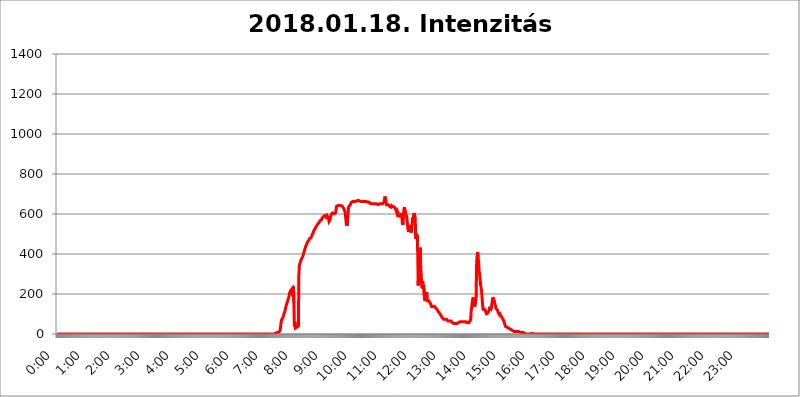
| Category | 2018.01.18. Intenzitás [W/m^2] |
|---|---|
| 0.0 | 0 |
| 0.0006944444444444445 | 0 |
| 0.001388888888888889 | 0 |
| 0.0020833333333333333 | 0 |
| 0.002777777777777778 | 0 |
| 0.003472222222222222 | 0 |
| 0.004166666666666667 | 0 |
| 0.004861111111111111 | 0 |
| 0.005555555555555556 | 0 |
| 0.0062499999999999995 | 0 |
| 0.006944444444444444 | 0 |
| 0.007638888888888889 | 0 |
| 0.008333333333333333 | 0 |
| 0.009027777777777779 | 0 |
| 0.009722222222222222 | 0 |
| 0.010416666666666666 | 0 |
| 0.011111111111111112 | 0 |
| 0.011805555555555555 | 0 |
| 0.012499999999999999 | 0 |
| 0.013194444444444444 | 0 |
| 0.013888888888888888 | 0 |
| 0.014583333333333332 | 0 |
| 0.015277777777777777 | 0 |
| 0.015972222222222224 | 0 |
| 0.016666666666666666 | 0 |
| 0.017361111111111112 | 0 |
| 0.018055555555555557 | 0 |
| 0.01875 | 0 |
| 0.019444444444444445 | 0 |
| 0.02013888888888889 | 0 |
| 0.020833333333333332 | 0 |
| 0.02152777777777778 | 0 |
| 0.022222222222222223 | 0 |
| 0.02291666666666667 | 0 |
| 0.02361111111111111 | 0 |
| 0.024305555555555556 | 0 |
| 0.024999999999999998 | 0 |
| 0.025694444444444447 | 0 |
| 0.02638888888888889 | 0 |
| 0.027083333333333334 | 0 |
| 0.027777777777777776 | 0 |
| 0.02847222222222222 | 0 |
| 0.029166666666666664 | 0 |
| 0.029861111111111113 | 0 |
| 0.030555555555555555 | 0 |
| 0.03125 | 0 |
| 0.03194444444444445 | 0 |
| 0.03263888888888889 | 0 |
| 0.03333333333333333 | 0 |
| 0.034027777777777775 | 0 |
| 0.034722222222222224 | 0 |
| 0.035416666666666666 | 0 |
| 0.036111111111111115 | 0 |
| 0.03680555555555556 | 0 |
| 0.0375 | 0 |
| 0.03819444444444444 | 0 |
| 0.03888888888888889 | 0 |
| 0.03958333333333333 | 0 |
| 0.04027777777777778 | 0 |
| 0.04097222222222222 | 0 |
| 0.041666666666666664 | 0 |
| 0.042361111111111106 | 0 |
| 0.04305555555555556 | 0 |
| 0.043750000000000004 | 0 |
| 0.044444444444444446 | 0 |
| 0.04513888888888889 | 0 |
| 0.04583333333333334 | 0 |
| 0.04652777777777778 | 0 |
| 0.04722222222222222 | 0 |
| 0.04791666666666666 | 0 |
| 0.04861111111111111 | 0 |
| 0.049305555555555554 | 0 |
| 0.049999999999999996 | 0 |
| 0.05069444444444445 | 0 |
| 0.051388888888888894 | 0 |
| 0.052083333333333336 | 0 |
| 0.05277777777777778 | 0 |
| 0.05347222222222222 | 0 |
| 0.05416666666666667 | 0 |
| 0.05486111111111111 | 0 |
| 0.05555555555555555 | 0 |
| 0.05625 | 0 |
| 0.05694444444444444 | 0 |
| 0.057638888888888885 | 0 |
| 0.05833333333333333 | 0 |
| 0.05902777777777778 | 0 |
| 0.059722222222222225 | 0 |
| 0.06041666666666667 | 0 |
| 0.061111111111111116 | 0 |
| 0.06180555555555556 | 0 |
| 0.0625 | 0 |
| 0.06319444444444444 | 0 |
| 0.06388888888888888 | 0 |
| 0.06458333333333334 | 0 |
| 0.06527777777777778 | 0 |
| 0.06597222222222222 | 0 |
| 0.06666666666666667 | 0 |
| 0.06736111111111111 | 0 |
| 0.06805555555555555 | 0 |
| 0.06874999999999999 | 0 |
| 0.06944444444444443 | 0 |
| 0.07013888888888889 | 0 |
| 0.07083333333333333 | 0 |
| 0.07152777777777779 | 0 |
| 0.07222222222222223 | 0 |
| 0.07291666666666667 | 0 |
| 0.07361111111111111 | 0 |
| 0.07430555555555556 | 0 |
| 0.075 | 0 |
| 0.07569444444444444 | 0 |
| 0.0763888888888889 | 0 |
| 0.07708333333333334 | 0 |
| 0.07777777777777778 | 0 |
| 0.07847222222222222 | 0 |
| 0.07916666666666666 | 0 |
| 0.0798611111111111 | 0 |
| 0.08055555555555556 | 0 |
| 0.08125 | 0 |
| 0.08194444444444444 | 0 |
| 0.08263888888888889 | 0 |
| 0.08333333333333333 | 0 |
| 0.08402777777777777 | 0 |
| 0.08472222222222221 | 0 |
| 0.08541666666666665 | 0 |
| 0.08611111111111112 | 0 |
| 0.08680555555555557 | 0 |
| 0.08750000000000001 | 0 |
| 0.08819444444444445 | 0 |
| 0.08888888888888889 | 0 |
| 0.08958333333333333 | 0 |
| 0.09027777777777778 | 0 |
| 0.09097222222222222 | 0 |
| 0.09166666666666667 | 0 |
| 0.09236111111111112 | 0 |
| 0.09305555555555556 | 0 |
| 0.09375 | 0 |
| 0.09444444444444444 | 0 |
| 0.09513888888888888 | 0 |
| 0.09583333333333333 | 0 |
| 0.09652777777777777 | 0 |
| 0.09722222222222222 | 0 |
| 0.09791666666666667 | 0 |
| 0.09861111111111111 | 0 |
| 0.09930555555555555 | 0 |
| 0.09999999999999999 | 0 |
| 0.10069444444444443 | 0 |
| 0.1013888888888889 | 0 |
| 0.10208333333333335 | 0 |
| 0.10277777777777779 | 0 |
| 0.10347222222222223 | 0 |
| 0.10416666666666667 | 0 |
| 0.10486111111111111 | 0 |
| 0.10555555555555556 | 0 |
| 0.10625 | 0 |
| 0.10694444444444444 | 0 |
| 0.1076388888888889 | 0 |
| 0.10833333333333334 | 0 |
| 0.10902777777777778 | 0 |
| 0.10972222222222222 | 0 |
| 0.1111111111111111 | 0 |
| 0.11180555555555556 | 0 |
| 0.11180555555555556 | 0 |
| 0.1125 | 0 |
| 0.11319444444444444 | 0 |
| 0.11388888888888889 | 0 |
| 0.11458333333333333 | 0 |
| 0.11527777777777777 | 0 |
| 0.11597222222222221 | 0 |
| 0.11666666666666665 | 0 |
| 0.1173611111111111 | 0 |
| 0.11805555555555557 | 0 |
| 0.11944444444444445 | 0 |
| 0.12013888888888889 | 0 |
| 0.12083333333333333 | 0 |
| 0.12152777777777778 | 0 |
| 0.12222222222222223 | 0 |
| 0.12291666666666667 | 0 |
| 0.12291666666666667 | 0 |
| 0.12361111111111112 | 0 |
| 0.12430555555555556 | 0 |
| 0.125 | 0 |
| 0.12569444444444444 | 0 |
| 0.12638888888888888 | 0 |
| 0.12708333333333333 | 0 |
| 0.16875 | 0 |
| 0.12847222222222224 | 0 |
| 0.12916666666666668 | 0 |
| 0.12986111111111112 | 0 |
| 0.13055555555555556 | 0 |
| 0.13125 | 0 |
| 0.13194444444444445 | 0 |
| 0.1326388888888889 | 0 |
| 0.13333333333333333 | 0 |
| 0.13402777777777777 | 0 |
| 0.13402777777777777 | 0 |
| 0.13472222222222222 | 0 |
| 0.13541666666666666 | 0 |
| 0.1361111111111111 | 0 |
| 0.13749999999999998 | 0 |
| 0.13819444444444443 | 0 |
| 0.1388888888888889 | 0 |
| 0.13958333333333334 | 0 |
| 0.14027777777777778 | 0 |
| 0.14097222222222222 | 0 |
| 0.14166666666666666 | 0 |
| 0.1423611111111111 | 0 |
| 0.14305555555555557 | 0 |
| 0.14375000000000002 | 0 |
| 0.14444444444444446 | 0 |
| 0.1451388888888889 | 0 |
| 0.1451388888888889 | 0 |
| 0.14652777777777778 | 0 |
| 0.14722222222222223 | 0 |
| 0.14791666666666667 | 0 |
| 0.1486111111111111 | 0 |
| 0.14930555555555555 | 0 |
| 0.15 | 0 |
| 0.15069444444444444 | 0 |
| 0.15138888888888888 | 0 |
| 0.15208333333333332 | 0 |
| 0.15277777777777776 | 0 |
| 0.15347222222222223 | 0 |
| 0.15416666666666667 | 0 |
| 0.15486111111111112 | 0 |
| 0.15555555555555556 | 0 |
| 0.15625 | 0 |
| 0.15694444444444444 | 0 |
| 0.15763888888888888 | 0 |
| 0.15833333333333333 | 0 |
| 0.15902777777777777 | 0 |
| 0.15972222222222224 | 0 |
| 0.16041666666666668 | 0 |
| 0.16111111111111112 | 0 |
| 0.16180555555555556 | 0 |
| 0.1625 | 0 |
| 0.16319444444444445 | 0 |
| 0.1638888888888889 | 0 |
| 0.16458333333333333 | 0 |
| 0.16527777777777777 | 0 |
| 0.16597222222222222 | 0 |
| 0.16666666666666666 | 0 |
| 0.1673611111111111 | 0 |
| 0.16805555555555554 | 0 |
| 0.16874999999999998 | 0 |
| 0.16944444444444443 | 0 |
| 0.17013888888888887 | 0 |
| 0.1708333333333333 | 0 |
| 0.17152777777777775 | 0 |
| 0.17222222222222225 | 0 |
| 0.1729166666666667 | 0 |
| 0.17361111111111113 | 0 |
| 0.17430555555555557 | 0 |
| 0.17500000000000002 | 0 |
| 0.17569444444444446 | 0 |
| 0.1763888888888889 | 0 |
| 0.17708333333333334 | 0 |
| 0.17777777777777778 | 0 |
| 0.17847222222222223 | 0 |
| 0.17916666666666667 | 0 |
| 0.1798611111111111 | 0 |
| 0.18055555555555555 | 0 |
| 0.18125 | 0 |
| 0.18194444444444444 | 0 |
| 0.1826388888888889 | 0 |
| 0.18333333333333335 | 0 |
| 0.1840277777777778 | 0 |
| 0.18472222222222223 | 0 |
| 0.18541666666666667 | 0 |
| 0.18611111111111112 | 0 |
| 0.18680555555555556 | 0 |
| 0.1875 | 0 |
| 0.18819444444444444 | 0 |
| 0.18888888888888888 | 0 |
| 0.18958333333333333 | 0 |
| 0.19027777777777777 | 0 |
| 0.1909722222222222 | 0 |
| 0.19166666666666665 | 0 |
| 0.19236111111111112 | 0 |
| 0.19305555555555554 | 0 |
| 0.19375 | 0 |
| 0.19444444444444445 | 0 |
| 0.1951388888888889 | 0 |
| 0.19583333333333333 | 0 |
| 0.19652777777777777 | 0 |
| 0.19722222222222222 | 0 |
| 0.19791666666666666 | 0 |
| 0.1986111111111111 | 0 |
| 0.19930555555555554 | 0 |
| 0.19999999999999998 | 0 |
| 0.20069444444444443 | 0 |
| 0.20138888888888887 | 0 |
| 0.2020833333333333 | 0 |
| 0.2027777777777778 | 0 |
| 0.2034722222222222 | 0 |
| 0.2041666666666667 | 0 |
| 0.20486111111111113 | 0 |
| 0.20555555555555557 | 0 |
| 0.20625000000000002 | 0 |
| 0.20694444444444446 | 0 |
| 0.2076388888888889 | 0 |
| 0.20833333333333334 | 0 |
| 0.20902777777777778 | 0 |
| 0.20972222222222223 | 0 |
| 0.21041666666666667 | 0 |
| 0.2111111111111111 | 0 |
| 0.21180555555555555 | 0 |
| 0.2125 | 0 |
| 0.21319444444444444 | 0 |
| 0.2138888888888889 | 0 |
| 0.21458333333333335 | 0 |
| 0.2152777777777778 | 0 |
| 0.21597222222222223 | 0 |
| 0.21666666666666667 | 0 |
| 0.21736111111111112 | 0 |
| 0.21805555555555556 | 0 |
| 0.21875 | 0 |
| 0.21944444444444444 | 0 |
| 0.22013888888888888 | 0 |
| 0.22083333333333333 | 0 |
| 0.22152777777777777 | 0 |
| 0.2222222222222222 | 0 |
| 0.22291666666666665 | 0 |
| 0.2236111111111111 | 0 |
| 0.22430555555555556 | 0 |
| 0.225 | 0 |
| 0.22569444444444445 | 0 |
| 0.2263888888888889 | 0 |
| 0.22708333333333333 | 0 |
| 0.22777777777777777 | 0 |
| 0.22847222222222222 | 0 |
| 0.22916666666666666 | 0 |
| 0.2298611111111111 | 0 |
| 0.23055555555555554 | 0 |
| 0.23124999999999998 | 0 |
| 0.23194444444444443 | 0 |
| 0.23263888888888887 | 0 |
| 0.2333333333333333 | 0 |
| 0.2340277777777778 | 0 |
| 0.2347222222222222 | 0 |
| 0.2354166666666667 | 0 |
| 0.23611111111111113 | 0 |
| 0.23680555555555557 | 0 |
| 0.23750000000000002 | 0 |
| 0.23819444444444446 | 0 |
| 0.2388888888888889 | 0 |
| 0.23958333333333334 | 0 |
| 0.24027777777777778 | 0 |
| 0.24097222222222223 | 0 |
| 0.24166666666666667 | 0 |
| 0.2423611111111111 | 0 |
| 0.24305555555555555 | 0 |
| 0.24375 | 0 |
| 0.24444444444444446 | 0 |
| 0.24513888888888888 | 0 |
| 0.24583333333333335 | 0 |
| 0.2465277777777778 | 0 |
| 0.24722222222222223 | 0 |
| 0.24791666666666667 | 0 |
| 0.24861111111111112 | 0 |
| 0.24930555555555556 | 0 |
| 0.25 | 0 |
| 0.25069444444444444 | 0 |
| 0.2513888888888889 | 0 |
| 0.2520833333333333 | 0 |
| 0.25277777777777777 | 0 |
| 0.2534722222222222 | 0 |
| 0.25416666666666665 | 0 |
| 0.2548611111111111 | 0 |
| 0.2555555555555556 | 0 |
| 0.25625000000000003 | 0 |
| 0.2569444444444445 | 0 |
| 0.2576388888888889 | 0 |
| 0.25833333333333336 | 0 |
| 0.2590277777777778 | 0 |
| 0.25972222222222224 | 0 |
| 0.2604166666666667 | 0 |
| 0.2611111111111111 | 0 |
| 0.26180555555555557 | 0 |
| 0.2625 | 0 |
| 0.26319444444444445 | 0 |
| 0.2638888888888889 | 0 |
| 0.26458333333333334 | 0 |
| 0.2652777777777778 | 0 |
| 0.2659722222222222 | 0 |
| 0.26666666666666666 | 0 |
| 0.2673611111111111 | 0 |
| 0.26805555555555555 | 0 |
| 0.26875 | 0 |
| 0.26944444444444443 | 0 |
| 0.2701388888888889 | 0 |
| 0.2708333333333333 | 0 |
| 0.27152777777777776 | 0 |
| 0.2722222222222222 | 0 |
| 0.27291666666666664 | 0 |
| 0.2736111111111111 | 0 |
| 0.2743055555555555 | 0 |
| 0.27499999999999997 | 0 |
| 0.27569444444444446 | 0 |
| 0.27638888888888885 | 0 |
| 0.27708333333333335 | 0 |
| 0.2777777777777778 | 0 |
| 0.27847222222222223 | 0 |
| 0.2791666666666667 | 0 |
| 0.2798611111111111 | 0 |
| 0.28055555555555556 | 0 |
| 0.28125 | 0 |
| 0.28194444444444444 | 0 |
| 0.2826388888888889 | 0 |
| 0.2833333333333333 | 0 |
| 0.28402777777777777 | 0 |
| 0.2847222222222222 | 0 |
| 0.28541666666666665 | 0 |
| 0.28611111111111115 | 0 |
| 0.28680555555555554 | 0 |
| 0.28750000000000003 | 0 |
| 0.2881944444444445 | 0 |
| 0.2888888888888889 | 0 |
| 0.28958333333333336 | 0 |
| 0.2902777777777778 | 0 |
| 0.29097222222222224 | 0 |
| 0.2916666666666667 | 0 |
| 0.2923611111111111 | 0 |
| 0.29305555555555557 | 0 |
| 0.29375 | 0 |
| 0.29444444444444445 | 0 |
| 0.2951388888888889 | 0 |
| 0.29583333333333334 | 0 |
| 0.2965277777777778 | 0 |
| 0.2972222222222222 | 0 |
| 0.29791666666666666 | 0 |
| 0.2986111111111111 | 0 |
| 0.29930555555555555 | 0 |
| 0.3 | 0 |
| 0.30069444444444443 | 0 |
| 0.3013888888888889 | 0 |
| 0.3020833333333333 | 0 |
| 0.30277777777777776 | 0 |
| 0.3034722222222222 | 0 |
| 0.30416666666666664 | 0 |
| 0.3048611111111111 | 3.525 |
| 0.3055555555555555 | 3.525 |
| 0.30624999999999997 | 3.525 |
| 0.3069444444444444 | 3.525 |
| 0.3076388888888889 | 3.525 |
| 0.30833333333333335 | 7.887 |
| 0.3090277777777778 | 7.887 |
| 0.30972222222222223 | 7.887 |
| 0.3104166666666667 | 7.887 |
| 0.3111111111111111 | 7.887 |
| 0.31180555555555556 | 12.257 |
| 0.3125 | 16.636 |
| 0.31319444444444444 | 34.234 |
| 0.3138888888888889 | 56.398 |
| 0.3145833333333333 | 69.775 |
| 0.31527777777777777 | 74.246 |
| 0.3159722222222222 | 74.246 |
| 0.31666666666666665 | 83.205 |
| 0.31736111111111115 | 92.184 |
| 0.31805555555555554 | 101.184 |
| 0.31875000000000003 | 105.69 |
| 0.3194444444444445 | 114.716 |
| 0.3201388888888889 | 128.284 |
| 0.32083333333333336 | 137.347 |
| 0.3215277777777778 | 146.423 |
| 0.32222222222222224 | 155.509 |
| 0.3229166666666667 | 160.056 |
| 0.3236111111111111 | 169.156 |
| 0.32430555555555557 | 178.264 |
| 0.325 | 187.378 |
| 0.32569444444444445 | 201.058 |
| 0.3263888888888889 | 210.182 |
| 0.32708333333333334 | 214.746 |
| 0.3277777777777778 | 219.309 |
| 0.3284722222222222 | 219.309 |
| 0.32916666666666666 | 223.873 |
| 0.3298611111111111 | 228.436 |
| 0.33055555555555555 | 187.378 |
| 0.33125 | 237.564 |
| 0.33194444444444443 | 155.509 |
| 0.3326388888888889 | 38.653 |
| 0.3333333333333333 | 60.85 |
| 0.3340277777777778 | 29.823 |
| 0.3347222222222222 | 29.823 |
| 0.3354166666666667 | 29.823 |
| 0.3361111111111111 | 34.234 |
| 0.3368055555555556 | 34.234 |
| 0.33749999999999997 | 38.653 |
| 0.33819444444444446 | 38.653 |
| 0.33888888888888885 | 296.808 |
| 0.33958333333333335 | 342.162 |
| 0.34027777777777773 | 351.198 |
| 0.34097222222222223 | 360.221 |
| 0.3416666666666666 | 364.728 |
| 0.3423611111111111 | 373.729 |
| 0.3430555555555555 | 373.729 |
| 0.34375 | 382.715 |
| 0.3444444444444445 | 382.715 |
| 0.3451388888888889 | 396.164 |
| 0.3458333333333334 | 405.108 |
| 0.34652777777777777 | 414.035 |
| 0.34722222222222227 | 422.943 |
| 0.34791666666666665 | 431.833 |
| 0.34861111111111115 | 440.702 |
| 0.34930555555555554 | 445.129 |
| 0.35000000000000003 | 449.551 |
| 0.3506944444444444 | 458.38 |
| 0.3513888888888889 | 458.38 |
| 0.3520833333333333 | 462.786 |
| 0.3527777777777778 | 467.187 |
| 0.3534722222222222 | 475.972 |
| 0.3541666666666667 | 475.972 |
| 0.3548611111111111 | 480.356 |
| 0.35555555555555557 | 480.356 |
| 0.35625 | 480.356 |
| 0.35694444444444445 | 489.108 |
| 0.3576388888888889 | 497.836 |
| 0.35833333333333334 | 502.192 |
| 0.3590277777777778 | 506.542 |
| 0.3597222222222222 | 515.223 |
| 0.36041666666666666 | 515.223 |
| 0.3611111111111111 | 523.88 |
| 0.36180555555555555 | 528.2 |
| 0.3625 | 532.513 |
| 0.36319444444444443 | 532.513 |
| 0.3638888888888889 | 541.121 |
| 0.3645833333333333 | 545.416 |
| 0.3652777777777778 | 549.704 |
| 0.3659722222222222 | 553.986 |
| 0.3666666666666667 | 553.986 |
| 0.3673611111111111 | 558.261 |
| 0.3680555555555556 | 562.53 |
| 0.36874999999999997 | 566.793 |
| 0.36944444444444446 | 566.793 |
| 0.37013888888888885 | 571.049 |
| 0.37083333333333335 | 571.049 |
| 0.37152777777777773 | 579.542 |
| 0.37222222222222223 | 579.542 |
| 0.3729166666666666 | 583.779 |
| 0.3736111111111111 | 588.009 |
| 0.3743055555555555 | 592.233 |
| 0.375 | 592.233 |
| 0.3756944444444445 | 592.233 |
| 0.3763888888888889 | 588.009 |
| 0.3770833333333334 | 583.779 |
| 0.37777777777777777 | 588.009 |
| 0.37847222222222227 | 592.233 |
| 0.37916666666666665 | 592.233 |
| 0.37986111111111115 | 583.779 |
| 0.38055555555555554 | 575.299 |
| 0.38125000000000003 | 562.53 |
| 0.3819444444444444 | 558.261 |
| 0.3826388888888889 | 571.049 |
| 0.3833333333333333 | 583.779 |
| 0.3840277777777778 | 596.45 |
| 0.3847222222222222 | 600.661 |
| 0.3854166666666667 | 600.661 |
| 0.3861111111111111 | 604.864 |
| 0.38680555555555557 | 600.661 |
| 0.3875 | 600.661 |
| 0.38819444444444445 | 600.661 |
| 0.3888888888888889 | 600.661 |
| 0.38958333333333334 | 600.661 |
| 0.3902777777777778 | 604.864 |
| 0.3909722222222222 | 617.436 |
| 0.39166666666666666 | 638.256 |
| 0.3923611111111111 | 634.105 |
| 0.39305555555555555 | 642.4 |
| 0.39375 | 642.4 |
| 0.39444444444444443 | 642.4 |
| 0.3951388888888889 | 642.4 |
| 0.3958333333333333 | 642.4 |
| 0.3965277777777778 | 642.4 |
| 0.3972222222222222 | 642.4 |
| 0.3979166666666667 | 642.4 |
| 0.3986111111111111 | 642.4 |
| 0.3993055555555556 | 642.4 |
| 0.39999999999999997 | 638.256 |
| 0.40069444444444446 | 634.105 |
| 0.40138888888888885 | 634.105 |
| 0.40208333333333335 | 625.784 |
| 0.40277777777777773 | 625.784 |
| 0.40347222222222223 | 613.252 |
| 0.4041666666666666 | 596.45 |
| 0.4048611111111111 | 571.049 |
| 0.4055555555555555 | 549.704 |
| 0.40625 | 541.121 |
| 0.4069444444444445 | 553.986 |
| 0.4076388888888889 | 588.009 |
| 0.4083333333333334 | 625.784 |
| 0.40902777777777777 | 638.256 |
| 0.40972222222222227 | 642.4 |
| 0.41041666666666665 | 642.4 |
| 0.41111111111111115 | 646.537 |
| 0.41180555555555554 | 650.667 |
| 0.41250000000000003 | 658.909 |
| 0.4131944444444444 | 654.791 |
| 0.4138888888888889 | 658.909 |
| 0.4145833333333333 | 663.019 |
| 0.4152777777777778 | 663.019 |
| 0.4159722222222222 | 658.909 |
| 0.4166666666666667 | 663.019 |
| 0.4173611111111111 | 663.019 |
| 0.41805555555555557 | 663.019 |
| 0.41875 | 663.019 |
| 0.41944444444444445 | 667.123 |
| 0.4201388888888889 | 667.123 |
| 0.42083333333333334 | 667.123 |
| 0.4215277777777778 | 667.123 |
| 0.4222222222222222 | 663.019 |
| 0.42291666666666666 | 667.123 |
| 0.4236111111111111 | 667.123 |
| 0.42430555555555555 | 667.123 |
| 0.425 | 663.019 |
| 0.42569444444444443 | 667.123 |
| 0.4263888888888889 | 663.019 |
| 0.4270833333333333 | 663.019 |
| 0.4277777777777778 | 663.019 |
| 0.4284722222222222 | 663.019 |
| 0.4291666666666667 | 663.019 |
| 0.4298611111111111 | 658.909 |
| 0.4305555555555556 | 663.019 |
| 0.43124999999999997 | 663.019 |
| 0.43194444444444446 | 663.019 |
| 0.43263888888888885 | 663.019 |
| 0.43333333333333335 | 663.019 |
| 0.43402777777777773 | 658.909 |
| 0.43472222222222223 | 663.019 |
| 0.4354166666666666 | 658.909 |
| 0.4361111111111111 | 663.019 |
| 0.4368055555555555 | 658.909 |
| 0.4375 | 658.909 |
| 0.4381944444444445 | 654.791 |
| 0.4388888888888889 | 654.791 |
| 0.4395833333333334 | 650.667 |
| 0.44027777777777777 | 650.667 |
| 0.44097222222222227 | 650.667 |
| 0.44166666666666665 | 650.667 |
| 0.44236111111111115 | 650.667 |
| 0.44305555555555554 | 650.667 |
| 0.44375000000000003 | 650.667 |
| 0.4444444444444444 | 646.537 |
| 0.4451388888888889 | 650.667 |
| 0.4458333333333333 | 650.667 |
| 0.4465277777777778 | 650.667 |
| 0.4472222222222222 | 654.791 |
| 0.4479166666666667 | 650.667 |
| 0.4486111111111111 | 650.667 |
| 0.44930555555555557 | 650.667 |
| 0.45 | 646.537 |
| 0.45069444444444445 | 650.667 |
| 0.4513888888888889 | 650.667 |
| 0.45208333333333334 | 650.667 |
| 0.4527777777777778 | 650.667 |
| 0.4534722222222222 | 650.667 |
| 0.45416666666666666 | 650.667 |
| 0.4548611111111111 | 646.537 |
| 0.45555555555555555 | 650.667 |
| 0.45625 | 650.667 |
| 0.45694444444444443 | 650.667 |
| 0.4576388888888889 | 654.791 |
| 0.4583333333333333 | 658.909 |
| 0.4590277777777778 | 663.019 |
| 0.4597222222222222 | 687.544 |
| 0.4604166666666667 | 683.473 |
| 0.4611111111111111 | 663.019 |
| 0.4618055555555556 | 646.537 |
| 0.46249999999999997 | 642.4 |
| 0.46319444444444446 | 646.537 |
| 0.46388888888888885 | 646.537 |
| 0.46458333333333335 | 642.4 |
| 0.46527777777777773 | 642.4 |
| 0.46597222222222223 | 638.256 |
| 0.4666666666666666 | 638.256 |
| 0.4673611111111111 | 638.256 |
| 0.4680555555555555 | 642.4 |
| 0.46875 | 634.105 |
| 0.4694444444444445 | 638.256 |
| 0.4701388888888889 | 634.105 |
| 0.4708333333333334 | 638.256 |
| 0.47152777777777777 | 638.256 |
| 0.47222222222222227 | 642.4 |
| 0.47291666666666665 | 634.105 |
| 0.47361111111111115 | 629.948 |
| 0.47430555555555554 | 629.948 |
| 0.47500000000000003 | 621.613 |
| 0.4756944444444444 | 613.252 |
| 0.4763888888888889 | 604.864 |
| 0.4770833333333333 | 613.252 |
| 0.4777777777777778 | 613.252 |
| 0.4784722222222222 | 600.661 |
| 0.4791666666666667 | 583.779 |
| 0.4798611111111111 | 592.233 |
| 0.48055555555555557 | 596.45 |
| 0.48125 | 592.233 |
| 0.48194444444444445 | 592.233 |
| 0.4826388888888889 | 604.864 |
| 0.48333333333333334 | 592.233 |
| 0.4840277777777778 | 553.986 |
| 0.4847222222222222 | 545.416 |
| 0.48541666666666666 | 596.45 |
| 0.4861111111111111 | 596.45 |
| 0.48680555555555555 | 634.105 |
| 0.4875 | 629.948 |
| 0.48819444444444443 | 609.062 |
| 0.4888888888888889 | 613.252 |
| 0.4895833333333333 | 609.062 |
| 0.4902777777777778 | 583.779 |
| 0.4909722222222222 | 558.261 |
| 0.4916666666666667 | 528.2 |
| 0.4923611111111111 | 532.513 |
| 0.4930555555555556 | 510.885 |
| 0.49374999999999997 | 510.885 |
| 0.49444444444444446 | 545.416 |
| 0.49513888888888885 | 545.416 |
| 0.49583333333333335 | 515.223 |
| 0.49652777777777773 | 506.542 |
| 0.49722222222222223 | 528.2 |
| 0.4979166666666666 | 549.704 |
| 0.4986111111111111 | 583.779 |
| 0.4993055555555555 | 571.049 |
| 0.5 | 596.45 |
| 0.5006944444444444 | 604.864 |
| 0.5013888888888889 | 609.062 |
| 0.5020833333333333 | 575.299 |
| 0.5027777777777778 | 475.972 |
| 0.5034722222222222 | 502.192 |
| 0.5041666666666667 | 475.972 |
| 0.5048611111111111 | 493.475 |
| 0.5055555555555555 | 414.035 |
| 0.50625 | 242.127 |
| 0.5069444444444444 | 310.44 |
| 0.5076388888888889 | 314.98 |
| 0.5083333333333333 | 364.728 |
| 0.5090277777777777 | 431.833 |
| 0.5097222222222222 | 333.113 |
| 0.5104166666666666 | 301.354 |
| 0.5111111111111112 | 246.689 |
| 0.5118055555555555 | 228.436 |
| 0.5125000000000001 | 264.932 |
| 0.5131944444444444 | 233 |
| 0.513888888888889 | 242.127 |
| 0.5145833333333333 | 242.127 |
| 0.5152777777777778 | 173.709 |
| 0.5159722222222222 | 164.605 |
| 0.5166666666666667 | 169.156 |
| 0.517361111111111 | 187.378 |
| 0.5180555555555556 | 210.182 |
| 0.5187499999999999 | 173.709 |
| 0.5194444444444445 | 164.605 |
| 0.5201388888888888 | 164.605 |
| 0.5208333333333334 | 160.056 |
| 0.5215277777777778 | 164.605 |
| 0.5222222222222223 | 160.056 |
| 0.5229166666666667 | 160.056 |
| 0.5236111111111111 | 150.964 |
| 0.5243055555555556 | 146.423 |
| 0.525 | 137.347 |
| 0.5256944444444445 | 137.347 |
| 0.5263888888888889 | 137.347 |
| 0.5270833333333333 | 137.347 |
| 0.5277777777777778 | 137.347 |
| 0.5284722222222222 | 137.347 |
| 0.5291666666666667 | 137.347 |
| 0.5298611111111111 | 137.347 |
| 0.5305555555555556 | 137.347 |
| 0.53125 | 128.284 |
| 0.5319444444444444 | 123.758 |
| 0.5326388888888889 | 123.758 |
| 0.5333333333333333 | 119.235 |
| 0.5340277777777778 | 114.716 |
| 0.5347222222222222 | 110.201 |
| 0.5354166666666667 | 105.69 |
| 0.5361111111111111 | 105.69 |
| 0.5368055555555555 | 101.184 |
| 0.5375 | 96.682 |
| 0.5381944444444444 | 92.184 |
| 0.5388888888888889 | 87.692 |
| 0.5395833333333333 | 83.205 |
| 0.5402777777777777 | 83.205 |
| 0.5409722222222222 | 78.722 |
| 0.5416666666666666 | 74.246 |
| 0.5423611111111112 | 78.722 |
| 0.5430555555555555 | 78.722 |
| 0.5437500000000001 | 74.246 |
| 0.5444444444444444 | 74.246 |
| 0.545138888888889 | 74.246 |
| 0.5458333333333333 | 74.246 |
| 0.5465277777777778 | 69.775 |
| 0.5472222222222222 | 69.775 |
| 0.5479166666666667 | 65.31 |
| 0.548611111111111 | 65.31 |
| 0.5493055555555556 | 65.31 |
| 0.5499999999999999 | 65.31 |
| 0.5506944444444445 | 65.31 |
| 0.5513888888888888 | 65.31 |
| 0.5520833333333334 | 65.31 |
| 0.5527777777777778 | 65.31 |
| 0.5534722222222223 | 60.85 |
| 0.5541666666666667 | 56.398 |
| 0.5548611111111111 | 56.398 |
| 0.5555555555555556 | 51.951 |
| 0.55625 | 51.951 |
| 0.5569444444444445 | 51.951 |
| 0.5576388888888889 | 51.951 |
| 0.5583333333333333 | 51.951 |
| 0.5590277777777778 | 51.951 |
| 0.5597222222222222 | 51.951 |
| 0.5604166666666667 | 51.951 |
| 0.5611111111111111 | 51.951 |
| 0.5618055555555556 | 56.398 |
| 0.5625 | 56.398 |
| 0.5631944444444444 | 56.398 |
| 0.5638888888888889 | 56.398 |
| 0.5645833333333333 | 60.85 |
| 0.5652777777777778 | 60.85 |
| 0.5659722222222222 | 60.85 |
| 0.5666666666666667 | 60.85 |
| 0.5673611111111111 | 60.85 |
| 0.5680555555555555 | 60.85 |
| 0.56875 | 60.85 |
| 0.5694444444444444 | 60.85 |
| 0.5701388888888889 | 60.85 |
| 0.5708333333333333 | 60.85 |
| 0.5715277777777777 | 60.85 |
| 0.5722222222222222 | 60.85 |
| 0.5729166666666666 | 60.85 |
| 0.5736111111111112 | 60.85 |
| 0.5743055555555555 | 56.398 |
| 0.5750000000000001 | 56.398 |
| 0.5756944444444444 | 56.398 |
| 0.576388888888889 | 56.398 |
| 0.5770833333333333 | 56.398 |
| 0.5777777777777778 | 56.398 |
| 0.5784722222222222 | 60.85 |
| 0.5791666666666667 | 65.31 |
| 0.579861111111111 | 74.246 |
| 0.5805555555555556 | 114.716 |
| 0.5812499999999999 | 132.814 |
| 0.5819444444444445 | 155.509 |
| 0.5826388888888888 | 169.156 |
| 0.5833333333333334 | 182.82 |
| 0.5840277777777778 | 155.509 |
| 0.5847222222222223 | 150.964 |
| 0.5854166666666667 | 137.347 |
| 0.5861111111111111 | 141.884 |
| 0.5868055555555556 | 164.605 |
| 0.5875 | 182.82 |
| 0.5881944444444445 | 351.198 |
| 0.5888888888888889 | 391.685 |
| 0.5895833333333333 | 409.574 |
| 0.5902777777777778 | 382.715 |
| 0.5909722222222222 | 360.221 |
| 0.5916666666666667 | 314.98 |
| 0.5923611111111111 | 301.354 |
| 0.5930555555555556 | 278.603 |
| 0.59375 | 246.689 |
| 0.5944444444444444 | 233 |
| 0.5951388888888889 | 214.746 |
| 0.5958333333333333 | 182.82 |
| 0.5965277777777778 | 146.423 |
| 0.5972222222222222 | 123.758 |
| 0.5979166666666667 | 128.284 |
| 0.5986111111111111 | 123.758 |
| 0.5993055555555555 | 123.758 |
| 0.6 | 123.758 |
| 0.6006944444444444 | 114.716 |
| 0.6013888888888889 | 110.201 |
| 0.6020833333333333 | 101.184 |
| 0.6027777777777777 | 101.184 |
| 0.6034722222222222 | 101.184 |
| 0.6041666666666666 | 105.69 |
| 0.6048611111111112 | 110.201 |
| 0.6055555555555555 | 119.235 |
| 0.6062500000000001 | 128.284 |
| 0.6069444444444444 | 128.284 |
| 0.607638888888889 | 123.758 |
| 0.6083333333333333 | 123.758 |
| 0.6090277777777778 | 132.814 |
| 0.6097222222222222 | 155.509 |
| 0.6104166666666667 | 169.156 |
| 0.611111111111111 | 182.82 |
| 0.6118055555555556 | 187.378 |
| 0.6124999999999999 | 178.264 |
| 0.6131944444444445 | 160.056 |
| 0.6138888888888888 | 150.964 |
| 0.6145833333333334 | 141.884 |
| 0.6152777777777778 | 128.284 |
| 0.6159722222222223 | 128.284 |
| 0.6166666666666667 | 123.758 |
| 0.6173611111111111 | 119.235 |
| 0.6180555555555556 | 110.201 |
| 0.61875 | 114.716 |
| 0.6194444444444445 | 101.184 |
| 0.6201388888888889 | 110.201 |
| 0.6208333333333333 | 96.682 |
| 0.6215277777777778 | 92.184 |
| 0.6222222222222222 | 92.184 |
| 0.6229166666666667 | 87.692 |
| 0.6236111111111111 | 83.205 |
| 0.6243055555555556 | 78.722 |
| 0.625 | 74.246 |
| 0.6256944444444444 | 74.246 |
| 0.6263888888888889 | 65.31 |
| 0.6270833333333333 | 56.398 |
| 0.6277777777777778 | 47.511 |
| 0.6284722222222222 | 38.653 |
| 0.6291666666666667 | 38.653 |
| 0.6298611111111111 | 38.653 |
| 0.6305555555555555 | 34.234 |
| 0.63125 | 29.823 |
| 0.6319444444444444 | 29.823 |
| 0.6326388888888889 | 29.823 |
| 0.6333333333333333 | 25.419 |
| 0.6340277777777777 | 25.419 |
| 0.6347222222222222 | 25.419 |
| 0.6354166666666666 | 21.024 |
| 0.6361111111111112 | 25.419 |
| 0.6368055555555555 | 21.024 |
| 0.6375000000000001 | 21.024 |
| 0.6381944444444444 | 16.636 |
| 0.638888888888889 | 16.636 |
| 0.6395833333333333 | 12.257 |
| 0.6402777777777778 | 12.257 |
| 0.6409722222222222 | 12.257 |
| 0.6416666666666667 | 12.257 |
| 0.642361111111111 | 12.257 |
| 0.6430555555555556 | 12.257 |
| 0.6437499999999999 | 12.257 |
| 0.6444444444444445 | 12.257 |
| 0.6451388888888888 | 12.257 |
| 0.6458333333333334 | 12.257 |
| 0.6465277777777778 | 12.257 |
| 0.6472222222222223 | 12.257 |
| 0.6479166666666667 | 7.887 |
| 0.6486111111111111 | 12.257 |
| 0.6493055555555556 | 7.887 |
| 0.65 | 7.887 |
| 0.6506944444444445 | 7.887 |
| 0.6513888888888889 | 7.887 |
| 0.6520833333333333 | 7.887 |
| 0.6527777777777778 | 7.887 |
| 0.6534722222222222 | 7.887 |
| 0.6541666666666667 | 3.525 |
| 0.6548611111111111 | 3.525 |
| 0.6555555555555556 | 3.525 |
| 0.65625 | 3.525 |
| 0.6569444444444444 | 3.525 |
| 0.6576388888888889 | 0 |
| 0.6583333333333333 | 0 |
| 0.6590277777777778 | 0 |
| 0.6597222222222222 | 0 |
| 0.6604166666666667 | 0 |
| 0.6611111111111111 | 0 |
| 0.6618055555555555 | 0 |
| 0.6625 | 0 |
| 0.6631944444444444 | 0 |
| 0.6638888888888889 | 0 |
| 0.6645833333333333 | 0 |
| 0.6652777777777777 | 3.525 |
| 0.6659722222222222 | 3.525 |
| 0.6666666666666666 | 0 |
| 0.6673611111111111 | 0 |
| 0.6680555555555556 | 0 |
| 0.6687500000000001 | 0 |
| 0.6694444444444444 | 0 |
| 0.6701388888888888 | 0 |
| 0.6708333333333334 | 0 |
| 0.6715277777777778 | 0 |
| 0.6722222222222222 | 0 |
| 0.6729166666666666 | 0 |
| 0.6736111111111112 | 0 |
| 0.6743055555555556 | 0 |
| 0.6749999999999999 | 0 |
| 0.6756944444444444 | 0 |
| 0.6763888888888889 | 0 |
| 0.6770833333333334 | 0 |
| 0.6777777777777777 | 0 |
| 0.6784722222222223 | 0 |
| 0.6791666666666667 | 0 |
| 0.6798611111111111 | 0 |
| 0.6805555555555555 | 0 |
| 0.68125 | 0 |
| 0.6819444444444445 | 0 |
| 0.6826388888888889 | 0 |
| 0.6833333333333332 | 0 |
| 0.6840277777777778 | 0 |
| 0.6847222222222222 | 0 |
| 0.6854166666666667 | 0 |
| 0.686111111111111 | 0 |
| 0.6868055555555556 | 0 |
| 0.6875 | 0 |
| 0.6881944444444444 | 0 |
| 0.688888888888889 | 0 |
| 0.6895833333333333 | 0 |
| 0.6902777777777778 | 0 |
| 0.6909722222222222 | 0 |
| 0.6916666666666668 | 0 |
| 0.6923611111111111 | 0 |
| 0.6930555555555555 | 0 |
| 0.69375 | 0 |
| 0.6944444444444445 | 0 |
| 0.6951388888888889 | 0 |
| 0.6958333333333333 | 0 |
| 0.6965277777777777 | 0 |
| 0.6972222222222223 | 0 |
| 0.6979166666666666 | 0 |
| 0.6986111111111111 | 0 |
| 0.6993055555555556 | 0 |
| 0.7000000000000001 | 0 |
| 0.7006944444444444 | 0 |
| 0.7013888888888888 | 0 |
| 0.7020833333333334 | 0 |
| 0.7027777777777778 | 0 |
| 0.7034722222222222 | 0 |
| 0.7041666666666666 | 0 |
| 0.7048611111111112 | 0 |
| 0.7055555555555556 | 0 |
| 0.7062499999999999 | 0 |
| 0.7069444444444444 | 0 |
| 0.7076388888888889 | 0 |
| 0.7083333333333334 | 0 |
| 0.7090277777777777 | 0 |
| 0.7097222222222223 | 0 |
| 0.7104166666666667 | 0 |
| 0.7111111111111111 | 0 |
| 0.7118055555555555 | 0 |
| 0.7125 | 0 |
| 0.7131944444444445 | 0 |
| 0.7138888888888889 | 0 |
| 0.7145833333333332 | 0 |
| 0.7152777777777778 | 0 |
| 0.7159722222222222 | 0 |
| 0.7166666666666667 | 0 |
| 0.717361111111111 | 0 |
| 0.7180555555555556 | 0 |
| 0.71875 | 0 |
| 0.7194444444444444 | 0 |
| 0.720138888888889 | 0 |
| 0.7208333333333333 | 0 |
| 0.7215277777777778 | 0 |
| 0.7222222222222222 | 0 |
| 0.7229166666666668 | 0 |
| 0.7236111111111111 | 0 |
| 0.7243055555555555 | 0 |
| 0.725 | 0 |
| 0.7256944444444445 | 0 |
| 0.7263888888888889 | 0 |
| 0.7270833333333333 | 0 |
| 0.7277777777777777 | 0 |
| 0.7284722222222223 | 0 |
| 0.7291666666666666 | 0 |
| 0.7298611111111111 | 0 |
| 0.7305555555555556 | 0 |
| 0.7312500000000001 | 0 |
| 0.7319444444444444 | 0 |
| 0.7326388888888888 | 0 |
| 0.7333333333333334 | 0 |
| 0.7340277777777778 | 0 |
| 0.7347222222222222 | 0 |
| 0.7354166666666666 | 0 |
| 0.7361111111111112 | 0 |
| 0.7368055555555556 | 0 |
| 0.7374999999999999 | 0 |
| 0.7381944444444444 | 0 |
| 0.7388888888888889 | 0 |
| 0.7395833333333334 | 0 |
| 0.7402777777777777 | 0 |
| 0.7409722222222223 | 0 |
| 0.7416666666666667 | 0 |
| 0.7423611111111111 | 0 |
| 0.7430555555555555 | 0 |
| 0.74375 | 0 |
| 0.7444444444444445 | 0 |
| 0.7451388888888889 | 0 |
| 0.7458333333333332 | 0 |
| 0.7465277777777778 | 0 |
| 0.7472222222222222 | 0 |
| 0.7479166666666667 | 0 |
| 0.748611111111111 | 0 |
| 0.7493055555555556 | 0 |
| 0.75 | 0 |
| 0.7506944444444444 | 0 |
| 0.751388888888889 | 0 |
| 0.7520833333333333 | 0 |
| 0.7527777777777778 | 0 |
| 0.7534722222222222 | 0 |
| 0.7541666666666668 | 0 |
| 0.7548611111111111 | 0 |
| 0.7555555555555555 | 0 |
| 0.75625 | 0 |
| 0.7569444444444445 | 0 |
| 0.7576388888888889 | 0 |
| 0.7583333333333333 | 0 |
| 0.7590277777777777 | 0 |
| 0.7597222222222223 | 0 |
| 0.7604166666666666 | 0 |
| 0.7611111111111111 | 0 |
| 0.7618055555555556 | 0 |
| 0.7625000000000001 | 0 |
| 0.7631944444444444 | 0 |
| 0.7638888888888888 | 0 |
| 0.7645833333333334 | 0 |
| 0.7652777777777778 | 0 |
| 0.7659722222222222 | 0 |
| 0.7666666666666666 | 0 |
| 0.7673611111111112 | 0 |
| 0.7680555555555556 | 0 |
| 0.7687499999999999 | 0 |
| 0.7694444444444444 | 0 |
| 0.7701388888888889 | 0 |
| 0.7708333333333334 | 0 |
| 0.7715277777777777 | 0 |
| 0.7722222222222223 | 0 |
| 0.7729166666666667 | 0 |
| 0.7736111111111111 | 0 |
| 0.7743055555555555 | 0 |
| 0.775 | 0 |
| 0.7756944444444445 | 0 |
| 0.7763888888888889 | 0 |
| 0.7770833333333332 | 0 |
| 0.7777777777777778 | 0 |
| 0.7784722222222222 | 0 |
| 0.7791666666666667 | 0 |
| 0.779861111111111 | 0 |
| 0.7805555555555556 | 0 |
| 0.78125 | 0 |
| 0.7819444444444444 | 0 |
| 0.782638888888889 | 0 |
| 0.7833333333333333 | 0 |
| 0.7840277777777778 | 0 |
| 0.7847222222222222 | 0 |
| 0.7854166666666668 | 0 |
| 0.7861111111111111 | 0 |
| 0.7868055555555555 | 0 |
| 0.7875 | 0 |
| 0.7881944444444445 | 0 |
| 0.7888888888888889 | 0 |
| 0.7895833333333333 | 0 |
| 0.7902777777777777 | 0 |
| 0.7909722222222223 | 0 |
| 0.7916666666666666 | 0 |
| 0.7923611111111111 | 0 |
| 0.7930555555555556 | 0 |
| 0.7937500000000001 | 0 |
| 0.7944444444444444 | 0 |
| 0.7951388888888888 | 0 |
| 0.7958333333333334 | 0 |
| 0.7965277777777778 | 0 |
| 0.7972222222222222 | 0 |
| 0.7979166666666666 | 0 |
| 0.7986111111111112 | 0 |
| 0.7993055555555556 | 0 |
| 0.7999999999999999 | 0 |
| 0.8006944444444444 | 0 |
| 0.8013888888888889 | 0 |
| 0.8020833333333334 | 0 |
| 0.8027777777777777 | 0 |
| 0.8034722222222223 | 0 |
| 0.8041666666666667 | 0 |
| 0.8048611111111111 | 0 |
| 0.8055555555555555 | 0 |
| 0.80625 | 0 |
| 0.8069444444444445 | 0 |
| 0.8076388888888889 | 0 |
| 0.8083333333333332 | 0 |
| 0.8090277777777778 | 0 |
| 0.8097222222222222 | 0 |
| 0.8104166666666667 | 0 |
| 0.811111111111111 | 0 |
| 0.8118055555555556 | 0 |
| 0.8125 | 0 |
| 0.8131944444444444 | 0 |
| 0.813888888888889 | 0 |
| 0.8145833333333333 | 0 |
| 0.8152777777777778 | 0 |
| 0.8159722222222222 | 0 |
| 0.8166666666666668 | 0 |
| 0.8173611111111111 | 0 |
| 0.8180555555555555 | 0 |
| 0.81875 | 0 |
| 0.8194444444444445 | 0 |
| 0.8201388888888889 | 0 |
| 0.8208333333333333 | 0 |
| 0.8215277777777777 | 0 |
| 0.8222222222222223 | 0 |
| 0.8229166666666666 | 0 |
| 0.8236111111111111 | 0 |
| 0.8243055555555556 | 0 |
| 0.8250000000000001 | 0 |
| 0.8256944444444444 | 0 |
| 0.8263888888888888 | 0 |
| 0.8270833333333334 | 0 |
| 0.8277777777777778 | 0 |
| 0.8284722222222222 | 0 |
| 0.8291666666666666 | 0 |
| 0.8298611111111112 | 0 |
| 0.8305555555555556 | 0 |
| 0.8312499999999999 | 0 |
| 0.8319444444444444 | 0 |
| 0.8326388888888889 | 0 |
| 0.8333333333333334 | 0 |
| 0.8340277777777777 | 0 |
| 0.8347222222222223 | 0 |
| 0.8354166666666667 | 0 |
| 0.8361111111111111 | 0 |
| 0.8368055555555555 | 0 |
| 0.8375 | 0 |
| 0.8381944444444445 | 0 |
| 0.8388888888888889 | 0 |
| 0.8395833333333332 | 0 |
| 0.8402777777777778 | 0 |
| 0.8409722222222222 | 0 |
| 0.8416666666666667 | 0 |
| 0.842361111111111 | 0 |
| 0.8430555555555556 | 0 |
| 0.84375 | 0 |
| 0.8444444444444444 | 0 |
| 0.845138888888889 | 0 |
| 0.8458333333333333 | 0 |
| 0.8465277777777778 | 0 |
| 0.8472222222222222 | 0 |
| 0.8479166666666668 | 0 |
| 0.8486111111111111 | 0 |
| 0.8493055555555555 | 0 |
| 0.85 | 0 |
| 0.8506944444444445 | 0 |
| 0.8513888888888889 | 0 |
| 0.8520833333333333 | 0 |
| 0.8527777777777777 | 0 |
| 0.8534722222222223 | 0 |
| 0.8541666666666666 | 0 |
| 0.8548611111111111 | 0 |
| 0.8555555555555556 | 0 |
| 0.8562500000000001 | 0 |
| 0.8569444444444444 | 0 |
| 0.8576388888888888 | 0 |
| 0.8583333333333334 | 0 |
| 0.8590277777777778 | 0 |
| 0.8597222222222222 | 0 |
| 0.8604166666666666 | 0 |
| 0.8611111111111112 | 0 |
| 0.8618055555555556 | 0 |
| 0.8624999999999999 | 0 |
| 0.8631944444444444 | 0 |
| 0.8638888888888889 | 0 |
| 0.8645833333333334 | 0 |
| 0.8652777777777777 | 0 |
| 0.8659722222222223 | 0 |
| 0.8666666666666667 | 0 |
| 0.8673611111111111 | 0 |
| 0.8680555555555555 | 0 |
| 0.86875 | 0 |
| 0.8694444444444445 | 0 |
| 0.8701388888888889 | 0 |
| 0.8708333333333332 | 0 |
| 0.8715277777777778 | 0 |
| 0.8722222222222222 | 0 |
| 0.8729166666666667 | 0 |
| 0.873611111111111 | 0 |
| 0.8743055555555556 | 0 |
| 0.875 | 0 |
| 0.8756944444444444 | 0 |
| 0.876388888888889 | 0 |
| 0.8770833333333333 | 0 |
| 0.8777777777777778 | 0 |
| 0.8784722222222222 | 0 |
| 0.8791666666666668 | 0 |
| 0.8798611111111111 | 0 |
| 0.8805555555555555 | 0 |
| 0.88125 | 0 |
| 0.8819444444444445 | 0 |
| 0.8826388888888889 | 0 |
| 0.8833333333333333 | 0 |
| 0.8840277777777777 | 0 |
| 0.8847222222222223 | 0 |
| 0.8854166666666666 | 0 |
| 0.8861111111111111 | 0 |
| 0.8868055555555556 | 0 |
| 0.8875000000000001 | 0 |
| 0.8881944444444444 | 0 |
| 0.8888888888888888 | 0 |
| 0.8895833333333334 | 0 |
| 0.8902777777777778 | 0 |
| 0.8909722222222222 | 0 |
| 0.8916666666666666 | 0 |
| 0.8923611111111112 | 0 |
| 0.8930555555555556 | 0 |
| 0.8937499999999999 | 0 |
| 0.8944444444444444 | 0 |
| 0.8951388888888889 | 0 |
| 0.8958333333333334 | 0 |
| 0.8965277777777777 | 0 |
| 0.8972222222222223 | 0 |
| 0.8979166666666667 | 0 |
| 0.8986111111111111 | 0 |
| 0.8993055555555555 | 0 |
| 0.9 | 0 |
| 0.9006944444444445 | 0 |
| 0.9013888888888889 | 0 |
| 0.9020833333333332 | 0 |
| 0.9027777777777778 | 0 |
| 0.9034722222222222 | 0 |
| 0.9041666666666667 | 0 |
| 0.904861111111111 | 0 |
| 0.9055555555555556 | 0 |
| 0.90625 | 0 |
| 0.9069444444444444 | 0 |
| 0.907638888888889 | 0 |
| 0.9083333333333333 | 0 |
| 0.9090277777777778 | 0 |
| 0.9097222222222222 | 0 |
| 0.9104166666666668 | 0 |
| 0.9111111111111111 | 0 |
| 0.9118055555555555 | 0 |
| 0.9125 | 0 |
| 0.9131944444444445 | 0 |
| 0.9138888888888889 | 0 |
| 0.9145833333333333 | 0 |
| 0.9152777777777777 | 0 |
| 0.9159722222222223 | 0 |
| 0.9166666666666666 | 0 |
| 0.9173611111111111 | 0 |
| 0.9180555555555556 | 0 |
| 0.9187500000000001 | 0 |
| 0.9194444444444444 | 0 |
| 0.9201388888888888 | 0 |
| 0.9208333333333334 | 0 |
| 0.9215277777777778 | 0 |
| 0.9222222222222222 | 0 |
| 0.9229166666666666 | 0 |
| 0.9236111111111112 | 0 |
| 0.9243055555555556 | 0 |
| 0.9249999999999999 | 0 |
| 0.9256944444444444 | 0 |
| 0.9263888888888889 | 0 |
| 0.9270833333333334 | 0 |
| 0.9277777777777777 | 0 |
| 0.9284722222222223 | 0 |
| 0.9291666666666667 | 0 |
| 0.9298611111111111 | 0 |
| 0.9305555555555555 | 0 |
| 0.93125 | 0 |
| 0.9319444444444445 | 0 |
| 0.9326388888888889 | 0 |
| 0.9333333333333332 | 0 |
| 0.9340277777777778 | 0 |
| 0.9347222222222222 | 0 |
| 0.9354166666666667 | 0 |
| 0.936111111111111 | 0 |
| 0.9368055555555556 | 0 |
| 0.9375 | 0 |
| 0.9381944444444444 | 0 |
| 0.938888888888889 | 0 |
| 0.9395833333333333 | 0 |
| 0.9402777777777778 | 0 |
| 0.9409722222222222 | 0 |
| 0.9416666666666668 | 0 |
| 0.9423611111111111 | 0 |
| 0.9430555555555555 | 0 |
| 0.94375 | 0 |
| 0.9444444444444445 | 0 |
| 0.9451388888888889 | 0 |
| 0.9458333333333333 | 0 |
| 0.9465277777777777 | 0 |
| 0.9472222222222223 | 0 |
| 0.9479166666666666 | 0 |
| 0.9486111111111111 | 0 |
| 0.9493055555555556 | 0 |
| 0.9500000000000001 | 0 |
| 0.9506944444444444 | 0 |
| 0.9513888888888888 | 0 |
| 0.9520833333333334 | 0 |
| 0.9527777777777778 | 0 |
| 0.9534722222222222 | 0 |
| 0.9541666666666666 | 0 |
| 0.9548611111111112 | 0 |
| 0.9555555555555556 | 0 |
| 0.9562499999999999 | 0 |
| 0.9569444444444444 | 0 |
| 0.9576388888888889 | 0 |
| 0.9583333333333334 | 0 |
| 0.9590277777777777 | 0 |
| 0.9597222222222223 | 0 |
| 0.9604166666666667 | 0 |
| 0.9611111111111111 | 0 |
| 0.9618055555555555 | 0 |
| 0.9625 | 0 |
| 0.9631944444444445 | 0 |
| 0.9638888888888889 | 0 |
| 0.9645833333333332 | 0 |
| 0.9652777777777778 | 0 |
| 0.9659722222222222 | 0 |
| 0.9666666666666667 | 0 |
| 0.967361111111111 | 0 |
| 0.9680555555555556 | 0 |
| 0.96875 | 0 |
| 0.9694444444444444 | 0 |
| 0.970138888888889 | 0 |
| 0.9708333333333333 | 0 |
| 0.9715277777777778 | 0 |
| 0.9722222222222222 | 0 |
| 0.9729166666666668 | 0 |
| 0.9736111111111111 | 0 |
| 0.9743055555555555 | 0 |
| 0.975 | 0 |
| 0.9756944444444445 | 0 |
| 0.9763888888888889 | 0 |
| 0.9770833333333333 | 0 |
| 0.9777777777777777 | 0 |
| 0.9784722222222223 | 0 |
| 0.9791666666666666 | 0 |
| 0.9798611111111111 | 0 |
| 0.9805555555555556 | 0 |
| 0.9812500000000001 | 0 |
| 0.9819444444444444 | 0 |
| 0.9826388888888888 | 0 |
| 0.9833333333333334 | 0 |
| 0.9840277777777778 | 0 |
| 0.9847222222222222 | 0 |
| 0.9854166666666666 | 0 |
| 0.9861111111111112 | 0 |
| 0.9868055555555556 | 0 |
| 0.9874999999999999 | 0 |
| 0.9881944444444444 | 0 |
| 0.9888888888888889 | 0 |
| 0.9895833333333334 | 0 |
| 0.9902777777777777 | 0 |
| 0.9909722222222223 | 0 |
| 0.9916666666666667 | 0 |
| 0.9923611111111111 | 0 |
| 0.9930555555555555 | 0 |
| 0.99375 | 0 |
| 0.9944444444444445 | 0 |
| 0.9951388888888889 | 0 |
| 0.9958333333333332 | 0 |
| 0.9965277777777778 | 0 |
| 0.9972222222222222 | 0 |
| 0.9979166666666667 | 0 |
| 0.998611111111111 | 0 |
| 0.9993055555555556 | 0 |